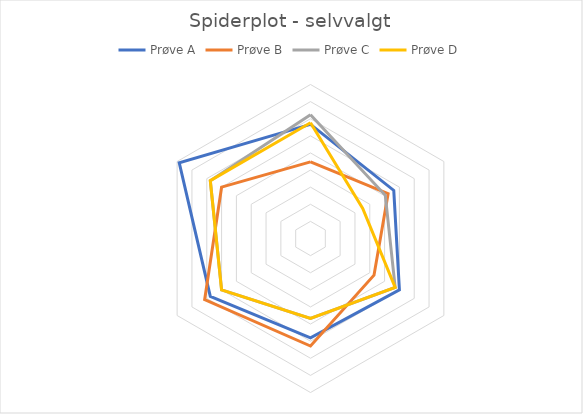
| Category | Prøve A | Prøve B | Prøve C | Prøve D |
|---|---|---|---|---|
|  | 3.333 | 2.238 | 3.619 | 3.381 |
|  | 2.81 | 2.619 | 2.524 | 1.762 |
|  | 3 | 2.143 | 2.857 | 2.857 |
|  | 2.905 | 3.143 | 2.333 | 2.333 |
|  | 3.381 | 3.571 | 3 | 3 |
|  | 4.429 | 3 | 3.381 | 3.381 |